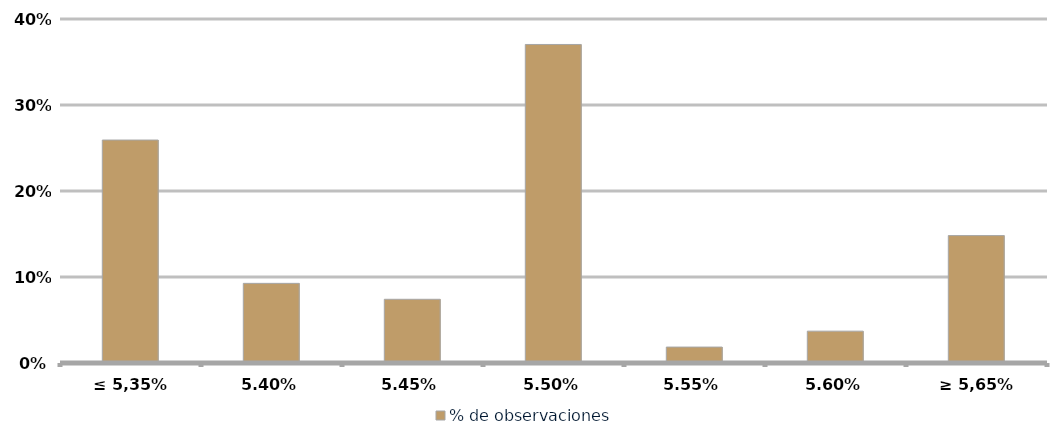
| Category | % de observaciones  |
|---|---|
| ≤ 5,35% | 0.259 |
| 5,40% | 0.093 |
| 5,45% | 0.074 |
| 5,50% | 0.37 |
| 5,55% | 0.019 |
| 5,60% | 0.037 |
| ≥ 5,65% | 0.148 |